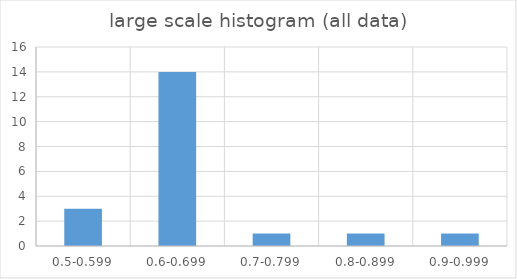
| Category | Series 0 |
|---|---|
| 0.5-0.599 | 3 |
| 0.6-0.699 | 14 |
| 0.7-0.799 | 1 |
| 0.8-0.899 | 1 |
| 0.9-0.999 | 1 |